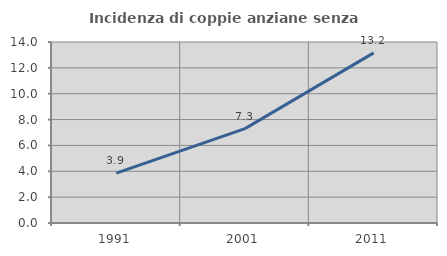
| Category | Incidenza di coppie anziane senza figli  |
|---|---|
| 1991.0 | 3.859 |
| 2001.0 | 7.3 |
| 2011.0 | 13.156 |